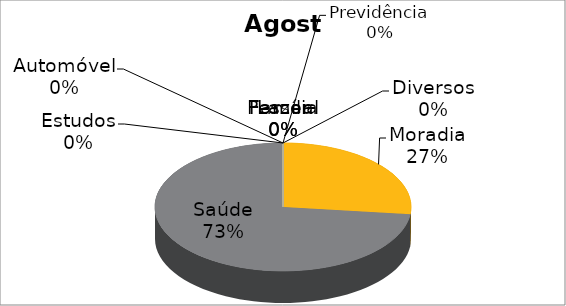
| Category | Agosto | Janeiro |
|---|---|---|
| Moradia | 1100 | 4020 |
| Saúde | 3000 | 100 |
| Estudos | 0 | 680 |
| Automóvel | 0 | 1230 |
| Pessoal | 0 | 640 |
| Lazer | 0 | 400 |
| Família | 0 | 700 |
| Previdência | 0 | 0 |
| Diversos | 0 | 0 |